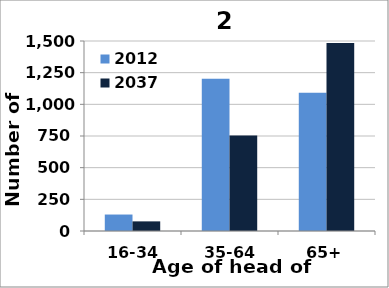
| Category | 2012 | 2037 |
|---|---|---|
| 16-34 | 130 | 76 |
| 35-64 | 1201 | 754 |
| 65+ | 1092 | 1485 |